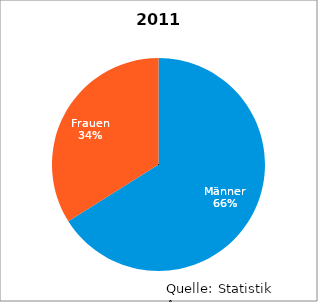
| Category | 2011 |
|---|---|
| Männer | 185 |
| Frauen | 95 |